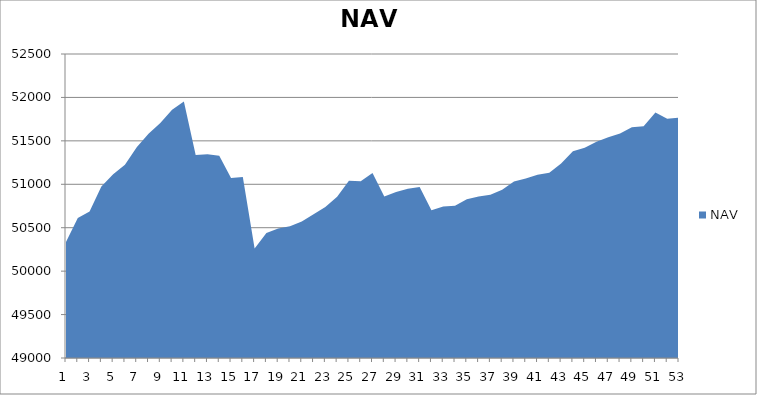
| Category | NAV |
|---|---|
| 0 | 50336.57 |
| 1 | 50612.255 |
| 2 | 50687.913 |
| 3 | 50975.413 |
| 4 | 51115.874 |
| 5 | 51223.542 |
| 6 | 51427.364 |
| 7 | 51580.567 |
| 8 | 51704.692 |
| 9 | 51858.016 |
| 10 | 51951.766 |
| 11 | 51336.067 |
| 12 | 51345.356 |
| 13 | 51328.667 |
| 14 | 51072.985 |
| 15 | 51085.199 |
| 16 | 50261.67 |
| 17 | 50438.394 |
| 18 | 50489.896 |
| 19 | 50518.251 |
| 20 | 50572.468 |
| 21 | 50655.55 |
| 22 | 50737.787 |
| 23 | 50856.035 |
| 24 | 51041.806 |
| 25 | 51034.925 |
| 26 | 51128.589 |
| 27 | 50859.456 |
| 28 | 50911.137 |
| 29 | 50950.007 |
| 30 | 50970.175 |
| 31 | 50701.326 |
| 32 | 50743.495 |
| 33 | 50751.546 |
| 34 | 50826.725 |
| 35 | 50860.533 |
| 36 | 50879.283 |
| 37 | 50936.644 |
| 38 | 51031.381 |
| 39 | 51065.306 |
| 40 | 51109.987 |
| 41 | 51132.251 |
| 42 | 51238.242 |
| 43 | 51380.786 |
| 44 | 51420.042 |
| 45 | 51490.787 |
| 46 | 51541.14 |
| 47 | 51584.924 |
| 48 | 51657.998 |
| 49 | 51667.348 |
| 50 | 51825.763 |
| 51 | 51755.412 |
| 52 | 51767.57 |